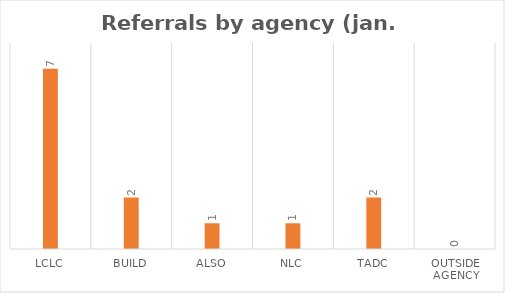
| Category | Series 0 |
|---|---|
| LCLC | 7 |
| BUILD | 2 |
| ALSO | 1 |
| NLC | 1 |
| TADC | 2 |
| Outside Agency | 0 |